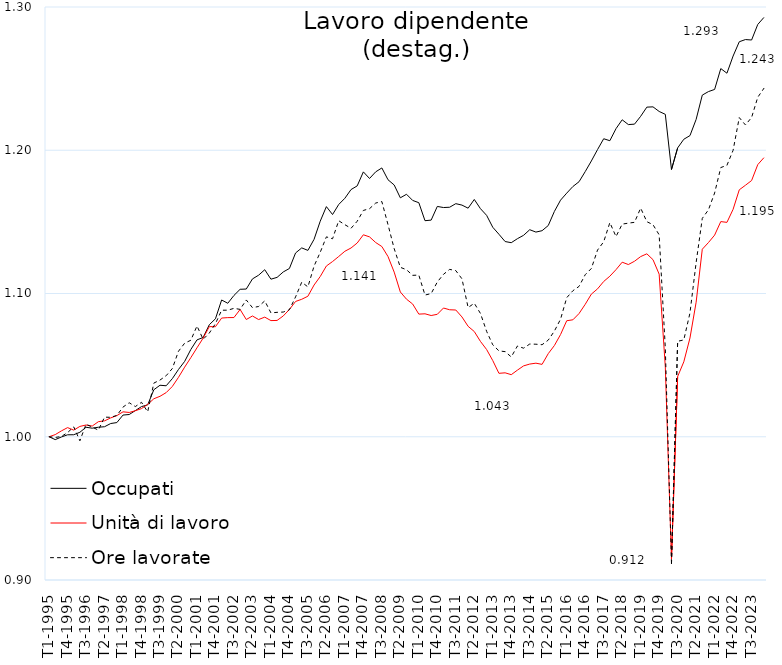
| Category | Occupati | Unità di lavoro | Ore lavorate |
|---|---|---|---|
| T1-1995 | 1 | 1 | 1 |
| T2-1995 | 0.998 | 1.002 | 1 |
| T3-1995 | 1 | 1.004 | 1 |
| T4-1995 | 1.001 | 1.006 | 1.003 |
| T1-1996 | 1.001 | 1.005 | 1.007 |
| T2-1996 | 1.003 | 1.007 | 0.997 |
| T3-1996 | 1.007 | 1.008 | 1.009 |
| T4-1996 | 1.006 | 1.007 | 1.007 |
| T1-1997 | 1.007 | 1.011 | 1.005 |
| T2-1997 | 1.007 | 1.011 | 1.014 |
| T3-1997 | 1.009 | 1.013 | 1.014 |
| T4-1997 | 1.01 | 1.015 | 1.015 |
| T1-1998 | 1.015 | 1.017 | 1.021 |
| T2-1998 | 1.016 | 1.017 | 1.024 |
| T3-1998 | 1.018 | 1.018 | 1.021 |
| T4-1998 | 1.021 | 1.02 | 1.024 |
| T1-1999 | 1.022 | 1.023 | 1.017 |
| T2-1999 | 1.033 | 1.027 | 1.037 |
| T3-1999 | 1.036 | 1.028 | 1.04 |
| T4-1999 | 1.036 | 1.031 | 1.043 |
| T1-2000 | 1.041 | 1.035 | 1.048 |
| T2-2000 | 1.047 | 1.041 | 1.06 |
| T3-2000 | 1.053 | 1.049 | 1.065 |
| T4-2000 | 1.061 | 1.055 | 1.067 |
| T1-2001 | 1.068 | 1.062 | 1.077 |
| T2-2001 | 1.069 | 1.069 | 1.068 |
| T3-2001 | 1.078 | 1.077 | 1.072 |
| T4-2001 | 1.082 | 1.077 | 1.079 |
| T1-2002 | 1.095 | 1.083 | 1.088 |
| T2-2002 | 1.093 | 1.083 | 1.088 |
| T3-2002 | 1.099 | 1.083 | 1.09 |
| T4-2002 | 1.103 | 1.089 | 1.089 |
| T1-2003 | 1.103 | 1.082 | 1.095 |
| T2-2003 | 1.11 | 1.084 | 1.09 |
| T3-2003 | 1.113 | 1.082 | 1.091 |
| T4-2003 | 1.117 | 1.084 | 1.095 |
| T1-2004 | 1.11 | 1.081 | 1.086 |
| T2-2004 | 1.111 | 1.081 | 1.087 |
| T3-2004 | 1.115 | 1.084 | 1.087 |
| T4-2004 | 1.117 | 1.089 | 1.089 |
| T1-2005 | 1.128 | 1.094 | 1.098 |
| T2-2005 | 1.132 | 1.096 | 1.108 |
| T3-2005 | 1.13 | 1.098 | 1.105 |
| T4-2005 | 1.138 | 1.106 | 1.119 |
| T1-2006 | 1.15 | 1.112 | 1.129 |
| T2-2006 | 1.161 | 1.119 | 1.14 |
| T3-2006 | 1.155 | 1.122 | 1.138 |
| T4-2006 | 1.162 | 1.126 | 1.151 |
| T1-2007 | 1.166 | 1.129 | 1.148 |
| T2-2007 | 1.173 | 1.132 | 1.146 |
| T3-2007 | 1.175 | 1.135 | 1.15 |
| T4-2007 | 1.185 | 1.141 | 1.158 |
| T1-2008 | 1.18 | 1.14 | 1.159 |
| T2-2008 | 1.185 | 1.136 | 1.163 |
| T3-2008 | 1.188 | 1.133 | 1.164 |
| T4-2008 | 1.179 | 1.126 | 1.148 |
| T1-2009 | 1.176 | 1.115 | 1.131 |
| T2-2009 | 1.167 | 1.101 | 1.118 |
| T3-2009 | 1.169 | 1.096 | 1.117 |
| T4-2009 | 1.165 | 1.093 | 1.113 |
| T1-2010 | 1.163 | 1.086 | 1.113 |
| T2-2010 | 1.151 | 1.086 | 1.099 |
| T3-2010 | 1.151 | 1.085 | 1.1 |
| T4-2010 | 1.161 | 1.085 | 1.108 |
| T1-2011 | 1.16 | 1.09 | 1.113 |
| T2-2011 | 1.16 | 1.089 | 1.117 |
| T3-2011 | 1.163 | 1.088 | 1.116 |
| T4-2011 | 1.162 | 1.084 | 1.11 |
| T1-2012 | 1.16 | 1.077 | 1.09 |
| T2-2012 | 1.166 | 1.073 | 1.093 |
| T3-2012 | 1.159 | 1.067 | 1.086 |
| T4-2012 | 1.155 | 1.061 | 1.074 |
| T1-2013 | 1.146 | 1.053 | 1.064 |
| T2-2013 | 1.141 | 1.044 | 1.06 |
| T3-2013 | 1.136 | 1.045 | 1.059 |
| T4-2013 | 1.135 | 1.043 | 1.056 |
| T1-2014 | 1.138 | 1.047 | 1.063 |
| T2-2014 | 1.141 | 1.049 | 1.062 |
| T3-2014 | 1.145 | 1.051 | 1.065 |
| T4-2014 | 1.143 | 1.051 | 1.065 |
| T1-2015 | 1.144 | 1.051 | 1.064 |
| T2-2015 | 1.147 | 1.058 | 1.067 |
| T3-2015 | 1.157 | 1.064 | 1.074 |
| T4-2015 | 1.165 | 1.071 | 1.082 |
| T1-2016 | 1.17 | 1.081 | 1.097 |
| T2-2016 | 1.175 | 1.082 | 1.102 |
| T3-2016 | 1.178 | 1.086 | 1.105 |
| T4-2016 | 1.185 | 1.092 | 1.113 |
| T1-2017 | 1.193 | 1.1 | 1.117 |
| T2-2017 | 1.2 | 1.103 | 1.13 |
| T3-2017 | 1.208 | 1.108 | 1.136 |
| T4-2017 | 1.207 | 1.112 | 1.15 |
| T1-2018 | 1.215 | 1.117 | 1.14 |
| T2-2018 | 1.221 | 1.122 | 1.148 |
| T3-2018 | 1.218 | 1.12 | 1.149 |
| T4-2018 | 1.218 | 1.123 | 1.15 |
| T1-2019 | 1.224 | 1.126 | 1.16 |
| T2-2019 | 1.23 | 1.128 | 1.15 |
| T3-2019 | 1.23 | 1.124 | 1.148 |
| T4-2019 | 1.227 | 1.113 | 1.141 |
| T1-2020 | 1.225 | 1.049 | 1.062 |
| T2-2020 | 1.187 | 0.914 | 0.912 |
| T3-2020 | 1.202 | 1.042 | 1.067 |
| T4-2020 | 1.208 | 1.052 | 1.068 |
| T1-2021 | 1.21 | 1.069 | 1.086 |
| T2-2021 | 1.222 | 1.094 | 1.122 |
| T3-2021 | 1.238 | 1.131 | 1.152 |
| T4-2021 | 1.241 | 1.136 | 1.158 |
| T1-2022 | 1.242 | 1.141 | 1.17 |
| T2-2022 | 1.257 | 1.15 | 1.188 |
| T3-2022 | 1.254 | 1.15 | 1.189 |
| T4-2022 | 1.266 | 1.159 | 1.2 |
| T1-2023 | 1.276 | 1.172 | 1.223 |
| T2-2023 | 1.277 | 1.176 | 1.218 |
| T3-2023 | 1.277 | 1.179 | 1.223 |
| T4-2023 | 1.288 | 1.19 | 1.237 |
| T1-2024 | 1.293 | 1.195 | 1.243 |